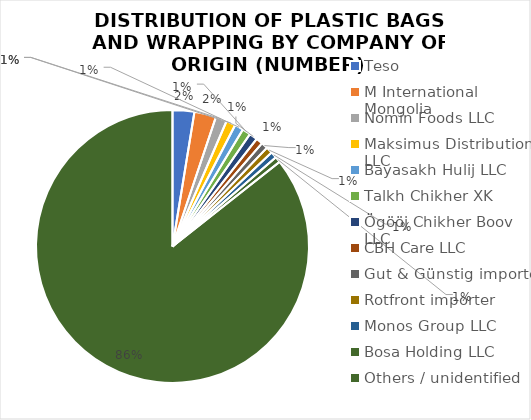
| Category | Series 0 |
|---|---|
| Teso | 149 |
| M International Mongolia | 149 |
| Nomin Foods LLC | 77 |
| Maksimus Distribution LLC | 64 |
| Bayasakh Hulij LLC | 60 |
| Talkh Chikher XK | 57 |
| Ögööj Chikher Boov LLC | 56 |
| CBH Care LLC | 46 |
| Gut & Günstig importer | 45 |
| Rotfront importer | 45 |
| Monos Group LLC | 43 |
| Bosa Holding LLC | 40 |
| Others / unidentified | 4958 |